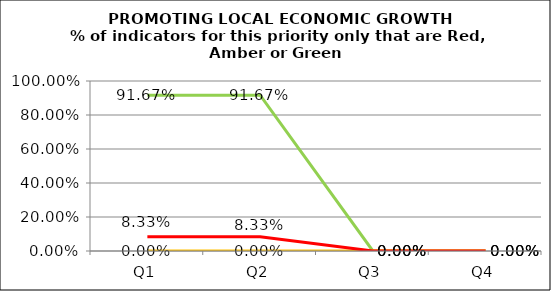
| Category | Green | Amber | Red |
|---|---|---|---|
| Q1 | 0.917 | 0 | 0.083 |
| Q2 | 0.917 | 0 | 0.083 |
| Q3 | 0 | 0 | 0 |
| Q4 | 0 | 0 | 0 |